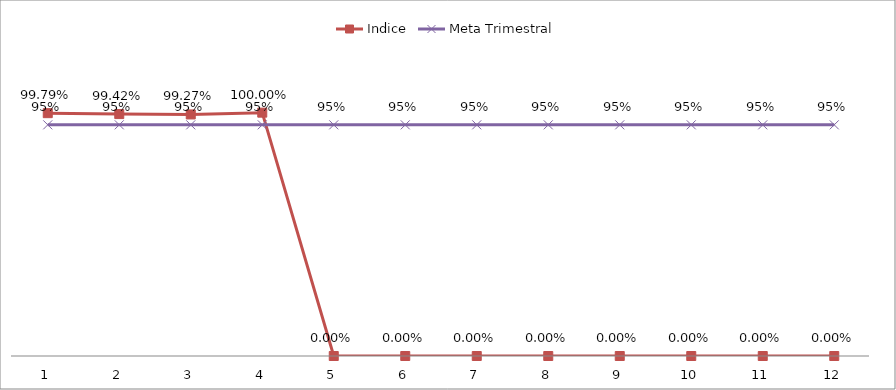
| Category | Indice | Meta Trimestral |
|---|---|---|
| 0 | 0.998 | 0.95 |
| 1 | 0.994 | 0.95 |
| 2 | 0.993 | 0.95 |
| 3 | 1 | 0.95 |
| 4 | 0 | 0.95 |
| 5 | 0 | 0.95 |
| 6 | 0 | 0.95 |
| 7 | 0 | 0.95 |
| 8 | 0 | 0.95 |
| 9 | 0 | 0.95 |
| 10 | 0 | 0.95 |
| 11 | 0 | 0.95 |